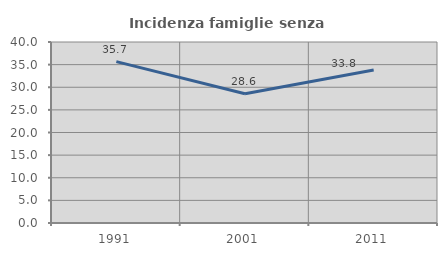
| Category | Incidenza famiglie senza nuclei |
|---|---|
| 1991.0 | 35.669 |
| 2001.0 | 28.571 |
| 2011.0 | 33.803 |